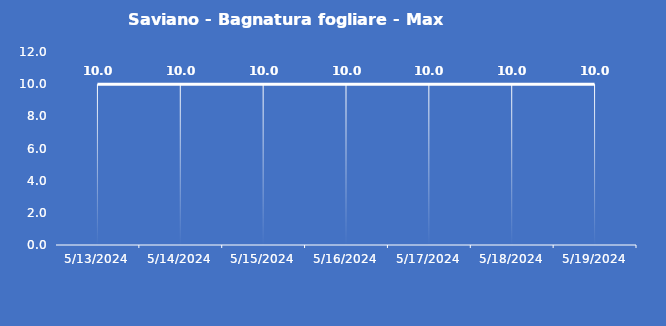
| Category | Saviano - Bagnatura fogliare - Max (min) |
|---|---|
| 5/13/24 | 10 |
| 5/14/24 | 10 |
| 5/15/24 | 10 |
| 5/16/24 | 10 |
| 5/17/24 | 10 |
| 5/18/24 | 10 |
| 5/19/24 | 10 |